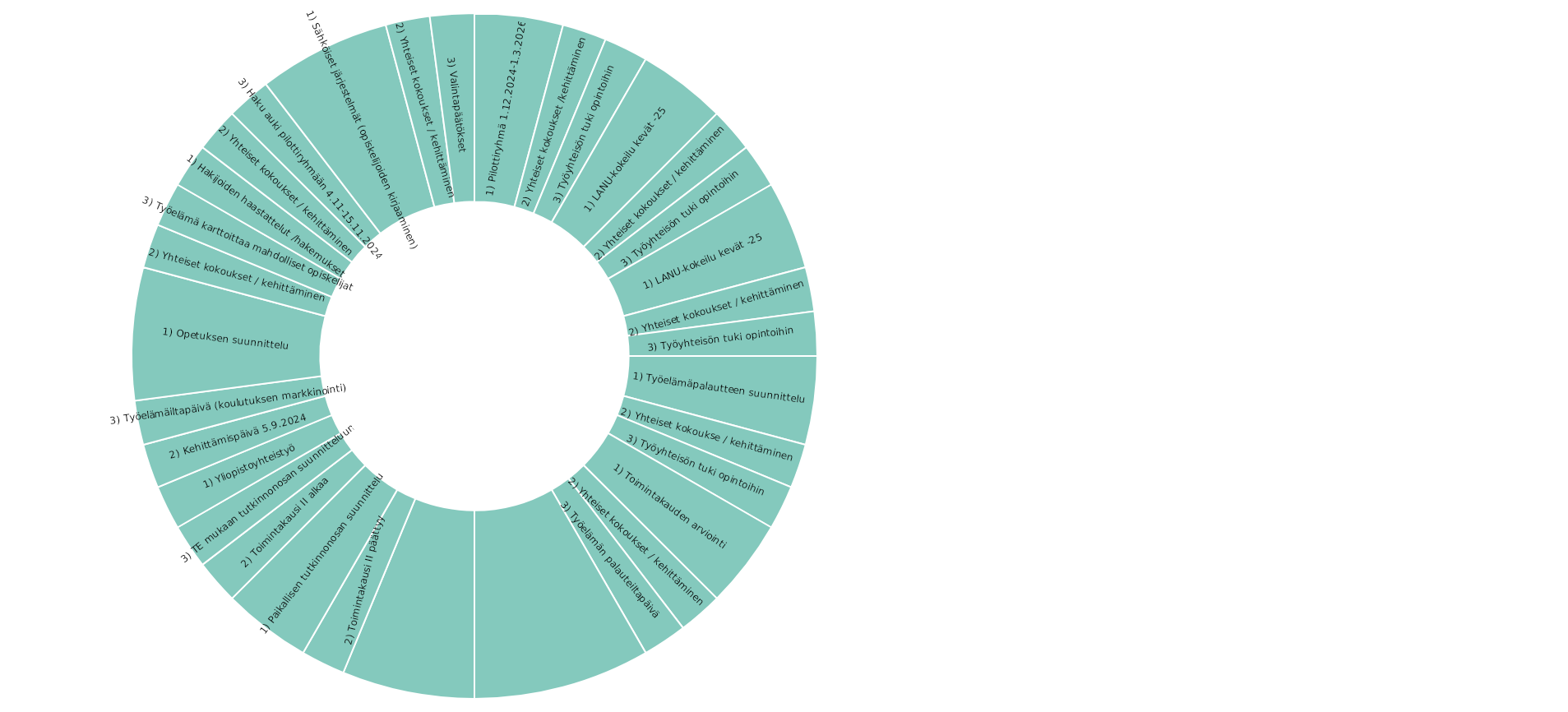
| Category | Series 0 |
|---|---|
| 1) Pilottiryhmä 1.12.2024-1.3.2026 | 2 |
| 2) Yhteiset kokoukset /kehittäminen | 1 |
| 3) Työyhteisön tuki opintoihin | 1 |
|  | 0 |
| 1) LANU-kokeilu kevät -25 | 2 |
| 2) Yhteiset kokoukset / kehittäminen | 1 |
| 3) Työyhteisön tuki opintoihin | 1 |
|  | 0 |
| 1) LANU-kokeilu kevät -25 | 2 |
| 2) Yhteiset kokoukset / kehittäminen | 1 |
| 3) Työyhteisön tuki opintoihin | 1 |
|  | 0 |
| 1) Työelämäpalautteen suunnittelu | 2 |
| 2) Yhteiset kokoukse / kehittäminen | 1 |
| 3) Työyhteisön tuki opintoihin | 1 |
|  | 0 |
| 1) Toimintakauden arviointi | 2 |
| 2) Yhteiset kokoukset / kehittäminen | 1 |
| 3) Työelämän palauteiltapäivä | 1 |
|  | 0 |
|  | 4 |
|  | 0 |
|  | 0 |
|  | 0 |
|  | 3 |
| 2) Toimintakausi II päättyy | 1 |
|  | 0 |
|  | 0 |
| 1) Paikallisen tutkinnonosan suunnittelu | 2 |
| 2) Toimintakausi II alkaa  | 1 |
| 3) TE mukaan tutkinnonosan suunnitteluun | 1 |
|  | 0 |
| 1) Yliopistoyhteistyö | 1 |
| 2) Kehittämispäivä 5.9.2024 | 1 |
| 3) Työelämäiltapäivä (koulutuksen markkinointi) | 1 |
| #VIITTAUS! | 0 |
| 1) Opetuksen suunnittelu | 3 |
| 2) Yhteiset kokoukset / kehittäminen | 1 |
| 3) Työelämä karttoittaa mahdolliset opiskelijat | 1 |
|  | 0 |
| 1) Hakijoiden haastattelut /hakemukset | 1 |
| 2) Yhteiset kokoukset / kehittäminen | 1 |
| 3) Haku auki pilottiryhmään 4.11-15.11.2024 | 1 |
| #VIITTAUS! | 0 |
| 1) Sähköiset järjestelmät (opiskelijoiden kirjaaminen) | 3 |
| 2) Yhteiset kokoukset / kehittäminen | 1 |
| 3) Valintapäätökset | 1 |